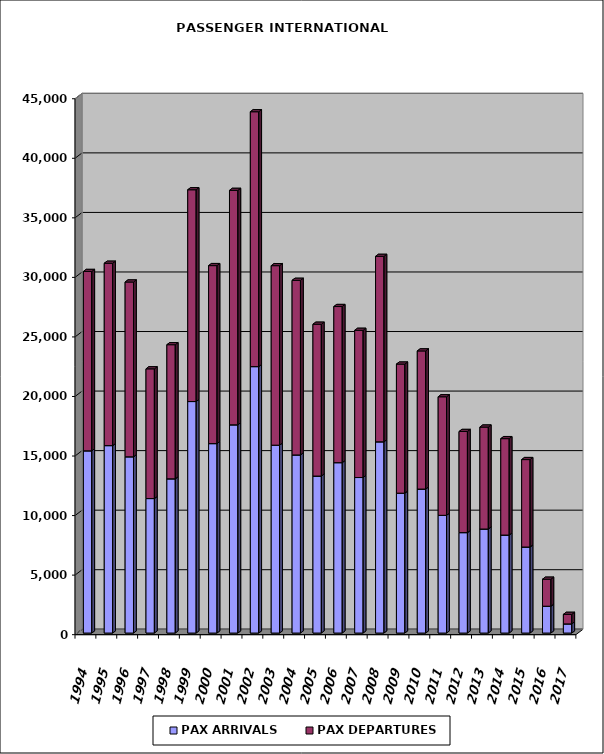
| Category | PAX ARRIVALS | PAX DEPARTURES |
|---|---|---|
| 1994.0 | 15300 | 15059 |
| 1995.0 | 15739 | 15311 |
| 1996.0 | 14799 | 14676 |
| 1997.0 | 11293 | 10891 |
| 1998.0 | 12949 | 11262 |
| 1999.0 | 19438 | 17784 |
| 2000.0 | 15907 | 14945 |
| 2001.0 | 17484 | 19683 |
| 2002.0 | 22372 | 21400 |
| 2003.0 | 15776 | 15072 |
| 2004.0 | 14956 | 14659 |
| 2005.0 | 13182 | 12747 |
| 2006.0 | 14307 | 13109 |
| 2007.0 | 13059 | 12358 |
| 2008.0 | 16058 | 15569 |
| 2009.0 | 11745 | 10837 |
| 2010.0 | 12090 | 11598 |
| 2011.0 | 9885 | 9954 |
| 2012.0 | 8433 | 8491 |
| 2013.0 | 8735 | 8559 |
| 2014.0 | 8228 | 8095 |
| 2015.0 | 7224 | 7341 |
| 2016.0 | 2253 | 2266 |
| 2017.0 | 768 | 800 |